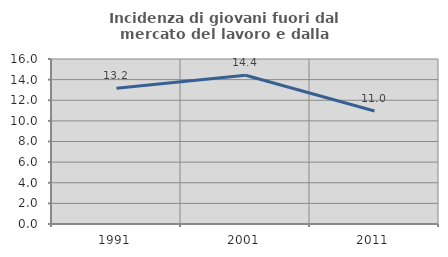
| Category | Incidenza di giovani fuori dal mercato del lavoro e dalla formazione  |
|---|---|
| 1991.0 | 13.164 |
| 2001.0 | 14.423 |
| 2011.0 | 10.954 |